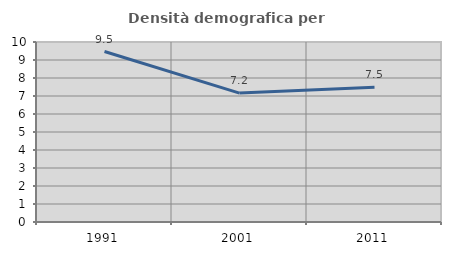
| Category | Densità demografica |
|---|---|
| 1991.0 | 9.469 |
| 2001.0 | 7.162 |
| 2011.0 | 7.48 |